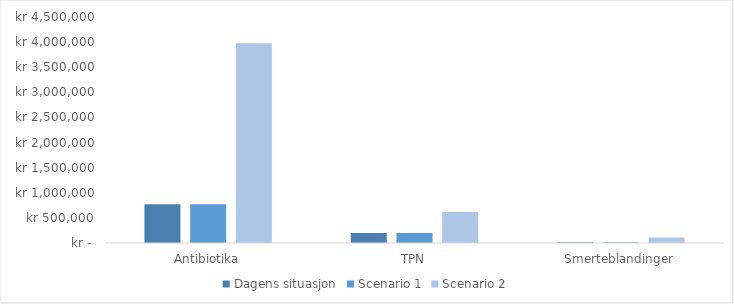
| Category | Dagens situasjon | Scenario 1 | Scenario 2 |
|---|---|---|---|
| Antibiotika | 772474.5 | 772474.5 | 3976400 |
| TPN | 199223.733 | 199223.733 | 616000 |
| Smerteblandinger | 13248 | 13248 | 108000 |